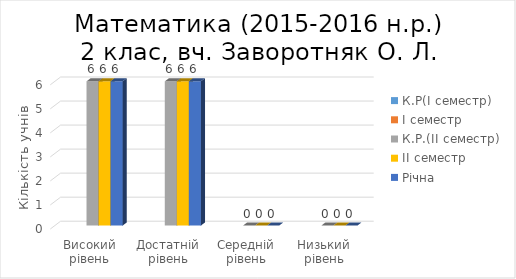
| Category | К.Р(І семестр) | І семестр | К.Р.(ІІ семестр) | ІІ семестр | Річна |
|---|---|---|---|---|---|
| Високий рівень |  |  | 6 | 6 | 6 |
| Достатній рівень |  |  | 6 | 6 | 6 |
| Середній рівень |  |  | 0 | 0 | 0 |
| Низький рівень |  |  | 0 | 0 | 0 |